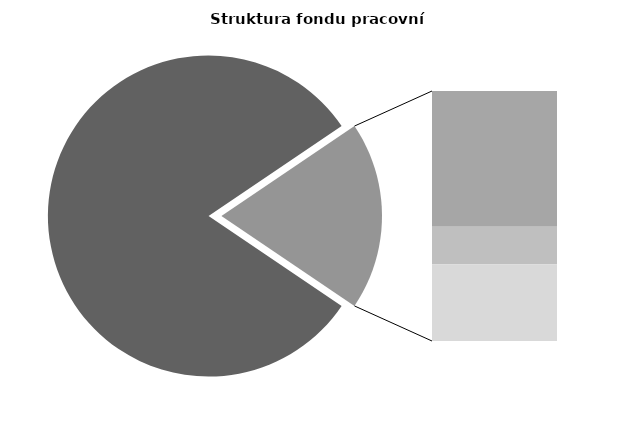
| Category | Series 0 |
|---|---|
| Průměrná měsíční odpracovaná doba bez přesčasu | 139.719 |
| Dovolená | 17.692 |
| Nemoc | 4.914 |
| Jiné | 9.997 |